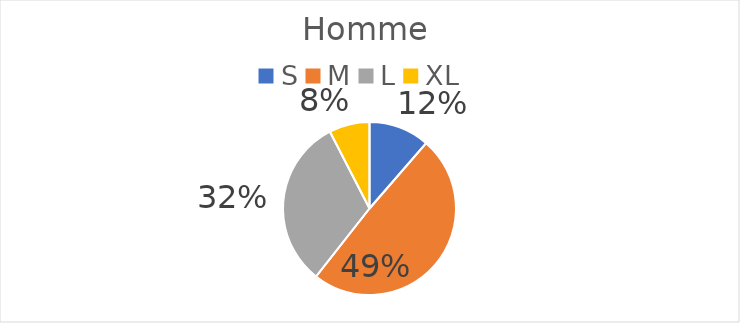
| Category | Series 0 |
|---|---|
| S | 15 |
| M | 65 |
| L | 42 |
| XL | 10 |